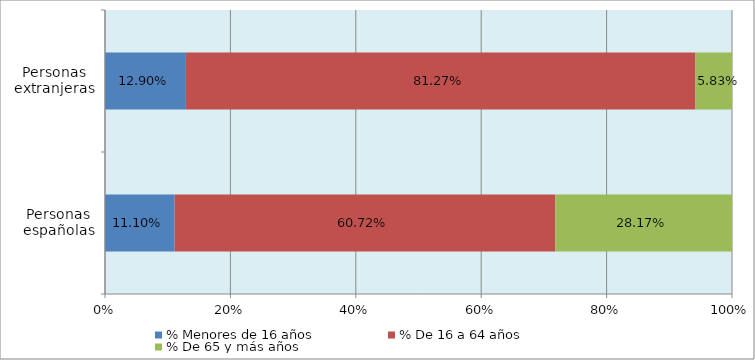
| Category | % Menores de 16 años | % De 16 a 64 años | % De 65 y más años |
|---|---|---|---|
| Personas españolas | 0.111 | 0.607 | 0.282 |
| Personas extranjeras | 0.129 | 0.813 | 0.058 |